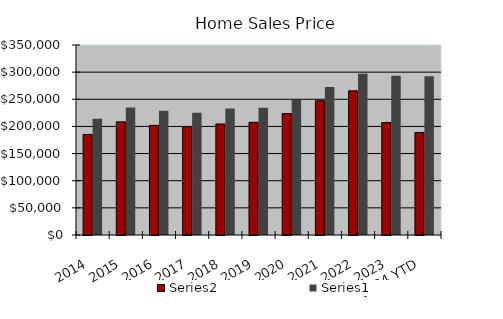
| Category | Series 1 | Series 0 |
|---|---|---|
| 2014 | 185264.75 | 214100.917 |
| 2015 | 208438 | 234978.917 |
| 2016 | 201992.583 | 229052.833 |
| 2017 | 199719.333 | 225120.667 |
| 2018 | 204587.25 | 232879.083 |
| 2019 | 207587.417 | 234221.583 |
| 2020 | 223776.25 | 248640.667 |
| 2021 | 247265.5 | 272817.917 |
| 2022 | 265530.083 | 296980.833 |
| 2023 | 207227.083 | 293494.833 |
| 2024 YTD | 188893.667 | 292653.333 |